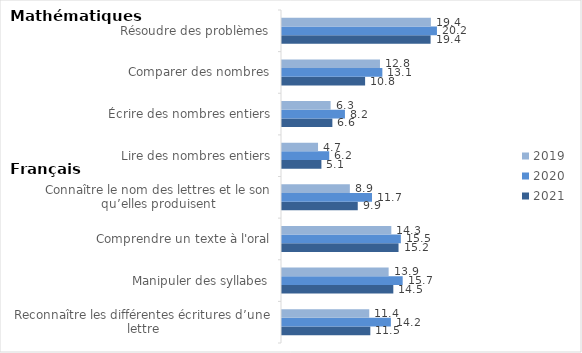
| Category | 2021 | 2020 | 2019 |
|---|---|---|---|
| Reconnaître les différentes écritures d’une lettre | 11.52 | 14.2 | 11.38 |
| Manipuler des syllabes | 14.52 | 15.74 | 13.91 |
| Comprendre un texte à l'oral | 15.2 | 15.5 | 14.26 |
| Connaître le nom des lettres et le son qu’elles produisent | 9.88 | 11.74 | 8.85 |
| Lire des nombres entiers | 5.14 | 6.16 | 4.7 |
| Écrire des nombres entiers | 6.57 | 8.21 | 6.34 |
| Comparer des nombres | 10.84 | 13.09 | 12.78 |
| Résoudre des problèmes | 19.38 | 20.21 | 19.42 |